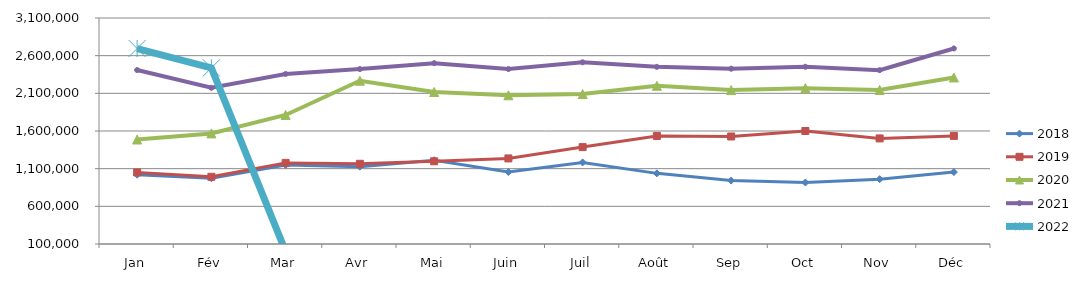
| Category | 2018 | 2019 | 2020 | 2021 | 2022 |
|---|---|---|---|---|---|
| Jan | 1019658.015 | 1050220.805 | 1487095.506 | 2408854.792 | 2694731.985 |
| Fév | 972274.256 | 992184.961 | 1568141.915 | 2173768.196 | 2437594.963 |
| Mar | 1147166.528 | 1176757.88 | 1813146.21 | 2357168.574 | 0 |
| Avr | 1126714.531 | 1164825.987 | 2267448.511 | 2422161.719 | 0 |
| Mai | 1212070.878 | 1197851.486 | 2117791.111 | 2500803.422 | 0 |
| Juin | 1056092.947 | 1235809.908 | 2073858.17 | 2421915.839 | 0 |
| Juil | 1183060.966 | 1386180.582 | 2090325.728 | 2512181.372 | 0 |
| Août | 1037606.311 | 1534426.4 | 2199836.197 | 2451614.864 | 0 |
| Sep | 941820.554 | 1527323.009 | 2142727.977 | 2426567.826 | 0 |
| Oct | 915772.772 | 1599889.902 | 2168338.194 | 2452518.375 | 0 |
| Nov | 960817.552 | 1501599.407 | 2145083.497 | 2407792.57 | 0 |
| Déc | 1054685.303 | 1534756.751 | 2310730.947 | 2695648.711 | 0 |